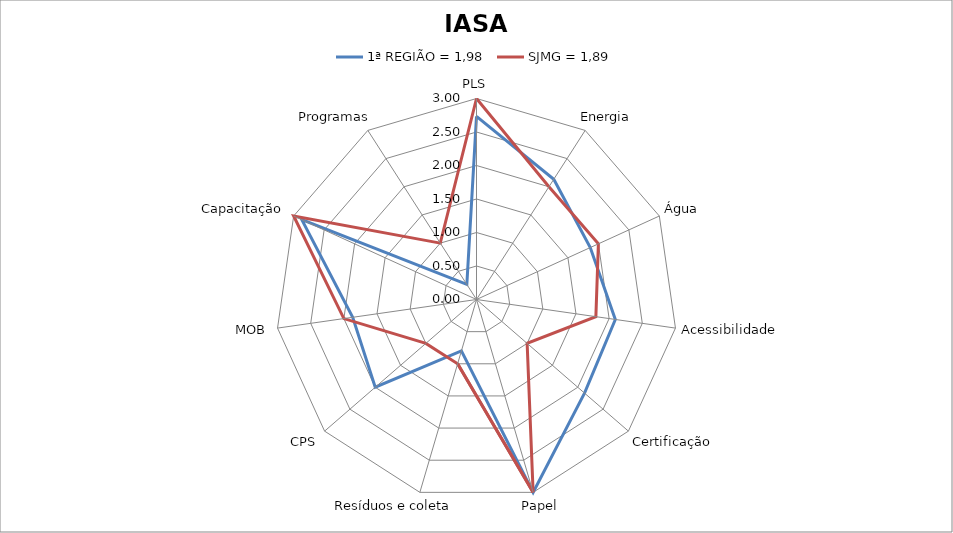
| Category | 1ª REGIÃO = 1,98 | SJMG = 1,89 |
|---|---|---|
| PLS | 2.733 | 3 |
| Energia | 2.133 | 2 |
| Água | 1.867 | 2 |
| Acessibilidade | 2.093 | 1.8 |
| Certificação | 2.133 | 1 |
| Papel | 3 | 3 |
| Resíduos e coleta | 0.8 | 1 |
| CPS | 2 | 1 |
| MOB | 1.867 | 2 |
| Capacitação | 2.867 | 3 |
| Programas | 0.267 | 1 |